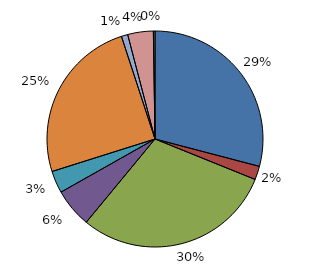
| Category | N |
|---|---|
| Eau | 3226 |
| Aménagement de Zones, Lotissement, Ateliers | 225 |
| Économie | 3313 |
| Tourisme-Culture-Sport | 647 |
| Santé-Social | 368 |
| Scolaire | 2755 |
| Transport | 106 |
| Ordures | 425 |
| Administration | 27 |